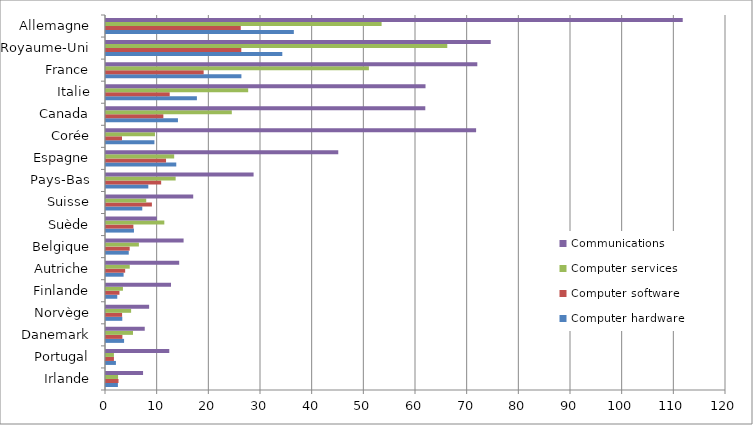
| Category | Computer hardware | Computer software | Computer services | Communications |
|---|---|---|---|---|
| Irlande | 2.306 | 2.422 | 2.335 | 7.172 |
| Portugal | 1.919 | 1.536 | 1.532 | 12.247 |
| Danemark | 3.499 | 3.174 | 5.231 | 7.499 |
| Norvège | 3.154 | 3.115 | 4.862 | 8.347 |
| Finlande | 2.179 | 2.605 | 3.277 | 12.583 |
| Autriche | 3.407 | 3.71 | 4.597 | 14.166 |
| Belgique | 4.405 | 4.581 | 6.367 | 15.018 |
| Suède | 5.411 | 5.302 | 11.287 | 9.846 |
| Suisse | 7.02 | 8.883 | 7.788 | 16.881 |
| Pays-Bas | 8.189 | 10.678 | 13.481 | 28.566 |
| Espagne | 13.6 | 11.621 | 13.195 | 44.955 |
| Corée | 9.369 | 3.099 | 9.48 | 71.634 |
| Canada | 13.924 | 11.101 | 24.35 | 61.799 |
| Italie | 17.594 | 12.332 | 27.52 | 61.843 |
| France | 26.208 | 18.899 | 50.884 | 71.867 |
| Royaume-Uni | 34.123 | 26.187 | 66.055 | 74.462 |
| Allemagne | 36.354 | 26.084 | 53.342 | 111.625 |